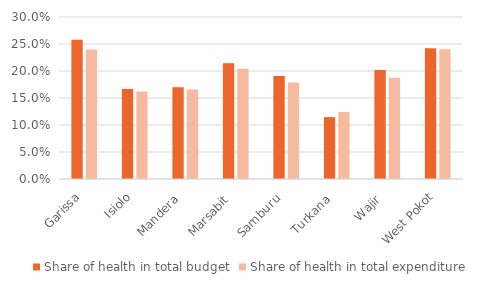
| Category | Share of health in total budget | Share of health in total expenditure |
|---|---|---|
| Garissa | 0.258 | 0.24 |
| Isiolo | 0.167 | 0.162 |
| Mandera  | 0.17 | 0.166 |
| Marsabit  | 0.214 | 0.204 |
| Samburu  | 0.191 | 0.178 |
| Turkana  | 0.115 | 0.124 |
| Wajir  | 0.202 | 0.188 |
| West Pokot | 0.242 | 0.24 |